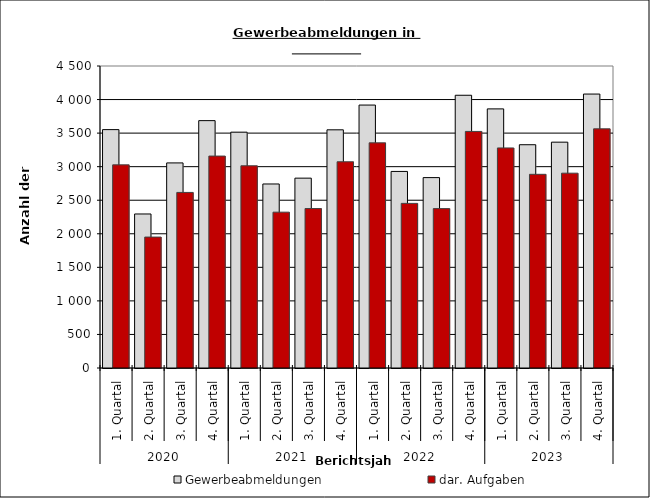
| Category | Gewerbeabmeldungen | dar. Aufgaben |
|---|---|---|
| 0 | 3552 | 3027 |
| 1 | 2295 | 1951 |
| 2 | 3056 | 2616 |
| 3 | 3686 | 3158 |
| 4 | 3514 | 3013 |
| 5 | 2742 | 2322 |
| 6 | 2829 | 2376 |
| 7 | 3549 | 3073 |
| 8 | 3918 | 3355 |
| 9 | 2929 | 2453 |
| 10 | 2837 | 2375 |
| 11 | 4064 | 3525 |
| 12 | 3861 | 3279 |
| 13 | 3327 | 2886 |
| 14 | 3365 | 2903 |
| 15 | 4082 | 3564 |